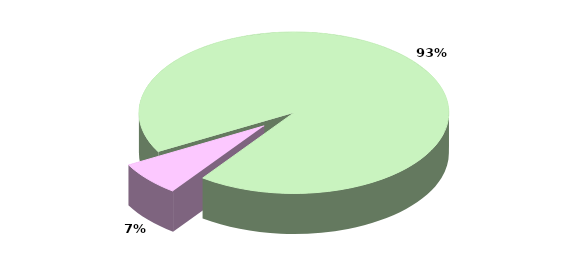
| Category | Series 0 |
|---|---|
| TOTALE ENTRATE CORRENTI | 21467.571 |
| TOTALE ENTRATE IN CONTO CAPITALE | 1599.949 |